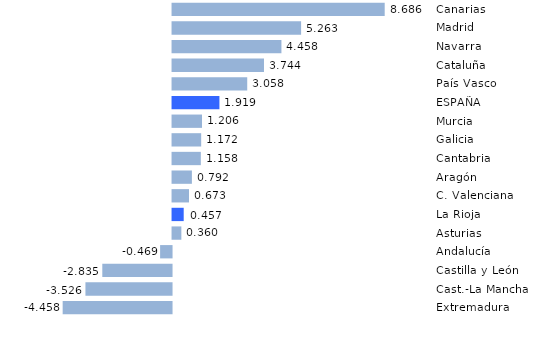
| Category | Series 0 |
|---|---|
| Extremadura | -4.458 |
| Cast.-La Mancha | -3.526 |
| Castilla y León | -2.835 |
| Andalucía | -0.469 |
| Asturias  | 0.36 |
| La Rioja | 0.457 |
| C. Valenciana | 0.673 |
| Aragón | 0.792 |
| Cantabria | 1.158 |
| Galicia | 1.172 |
| Murcia | 1.206 |
| ESPAÑA | 1.919 |
| País Vasco | 3.058 |
| Cataluña | 3.744 |
| Navarra  | 4.458 |
| Madrid | 5.263 |
| Canarias | 8.686 |